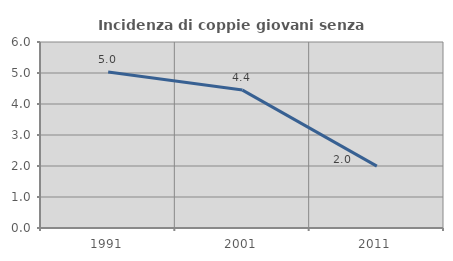
| Category | Incidenza di coppie giovani senza figli |
|---|---|
| 1991.0 | 5.035 |
| 2001.0 | 4.449 |
| 2011.0 | 1.997 |